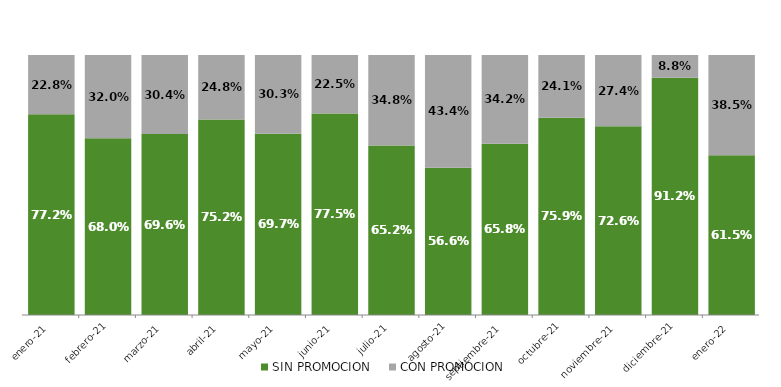
| Category | SIN PROMOCION   | CON PROMOCION   |
|---|---|---|
| 2021-01-01 | 0.772 | 0.228 |
| 2021-02-01 | 0.68 | 0.32 |
| 2021-03-01 | 0.696 | 0.304 |
| 2021-04-01 | 0.752 | 0.248 |
| 2021-05-01 | 0.697 | 0.303 |
| 2021-06-01 | 0.775 | 0.225 |
| 2021-07-01 | 0.652 | 0.348 |
| 2021-08-01 | 0.566 | 0.434 |
| 2021-09-01 | 0.658 | 0.342 |
| 2021-10-01 | 0.759 | 0.241 |
| 2021-11-01 | 0.726 | 0.274 |
| 2021-12-01 | 0.912 | 0.088 |
| 2022-01-01 | 0.615 | 0.385 |